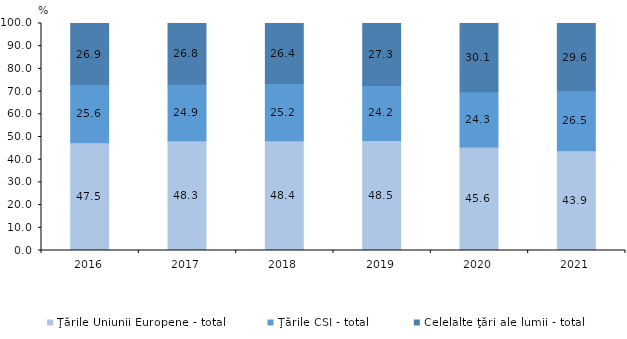
| Category | Ţările Uniunii Europene - total | Ţările CSI - total | Celelalte ţări ale lumii - total |
|---|---|---|---|
| 2016.0 | 47.5 | 25.6 | 26.9 |
| 2017.0 | 48.3 | 24.9 | 26.8 |
| 2018.0 | 48.4 | 25.2 | 26.4 |
| 2019.0 | 48.5 | 24.2 | 27.3 |
| 2020.0 | 45.6 | 24.3 | 30.1 |
| 2021.0 | 43.9 | 26.5 | 29.6 |